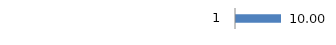
| Category | Percentuale |
|---|---|
| 0 | 10 |